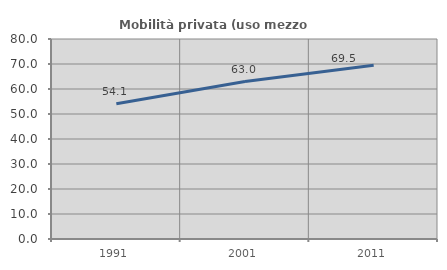
| Category | Mobilità privata (uso mezzo privato) |
|---|---|
| 1991.0 | 54.132 |
| 2001.0 | 62.971 |
| 2011.0 | 69.469 |